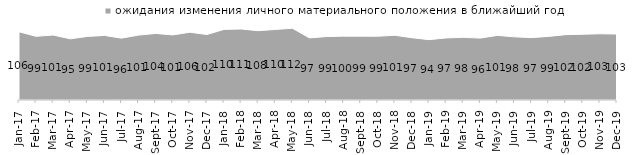
| Category | ожидания изменения личного материального положения в ближайший год |
|---|---|
| 2017-01-01 | 106.3 |
| 2017-02-01 | 99.25 |
| 2017-03-01 | 101.25 |
| 2017-04-01 | 95.3 |
| 2017-05-01 | 99.1 |
| 2017-06-01 | 100.6 |
| 2017-07-01 | 96.4 |
| 2017-08-01 | 101.15 |
| 2017-09-01 | 103.75 |
| 2017-10-01 | 101.45 |
| 2017-11-01 | 105.6 |
| 2017-12-01 | 102.05 |
| 2018-01-01 | 110.05 |
| 2018-02-01 | 110.65 |
| 2018-03-01 | 108 |
| 2018-04-01 | 109.95 |
| 2018-05-01 | 111.8 |
| 2018-06-01 | 96.75 |
| 2018-07-01 | 98.85 |
| 2018-08-01 | 99.5 |
| 2018-09-01 | 99.45 |
| 2018-10-01 | 99.4 |
| 2018-11-01 | 100.848 |
| 2018-12-01 | 97.05 |
| 2019-01-01 | 94.05 |
| 2019-02-01 | 96.75 |
| 2019-03-01 | 97.663 |
| 2019-04-01 | 96.436 |
| 2019-05-01 | 100.693 |
| 2019-06-01 | 98.404 |
| 2019-07-01 | 97.228 |
| 2019-08-01 | 99.151 |
| 2019-09-01 | 101.881 |
| 2019-10-01 | 102.475 |
| 2019-11-01 | 103.218 |
| 2019-12-01 | 102.772 |